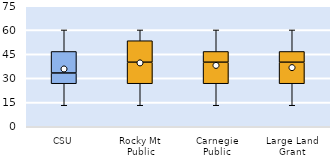
| Category | 25th | 50th | 75th |
|---|---|---|---|
| CSU | 26.667 | 6.667 | 13.333 |
| Rocky Mt Public | 26.667 | 13.333 | 13.333 |
| Carnegie Public | 26.667 | 13.333 | 6.667 |
| Large Land Grant | 26.667 | 13.333 | 6.667 |